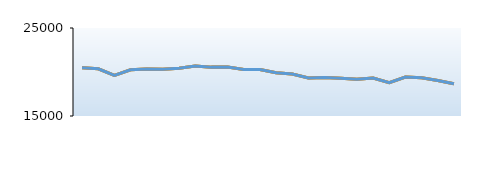
| Category | Mark Harris |
|---|---|
| Jan-15 | 20471 |
| Feb-15 | 20364 |
| Mar-15 | 19615 |
| Apr-15 | 20257 |
| May-15 | 20337 |
| Jun-15 | 20325 |
| Jul-15 | 20419 |
| Aug-15 | 20694 |
| Sep-15 | 20554 |
| Oct-15 | 20564 |
| Nov-15 | 20295 |
| Dec-15 | 20294 |
| Jan-16 | 19925 |
| Feb-16 | 19762 |
| Mar-16 | 19311 |
| Apr-16 | 19365 |
| May-16 | 19278 |
| Jun-16 | 19185 |
| Jul-16 | 19321 |
| Aug-16 | 18787 |
| Sep-16 | 19436 |
| Oct-16 | 19339 |
| Nov-16 | 19037 |
| Dec-16 | 18669 |